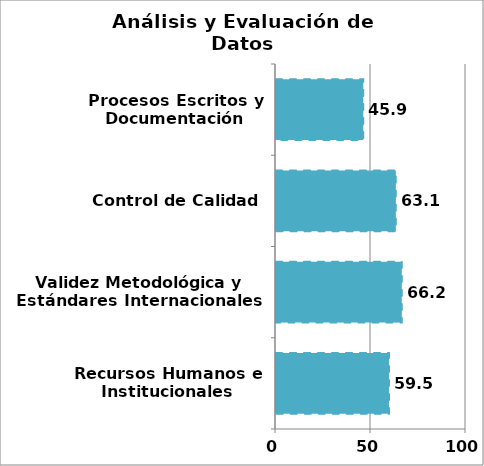
| Category | Series 0 |
|---|---|
| Recursos Humanos e Institucionales | 59.451 |
| Validez Metodológica y Estándares Internacionales | 66.195 |
| Control de Calidad | 63.077 |
| Procesos Escritos y Documentación | 45.926 |